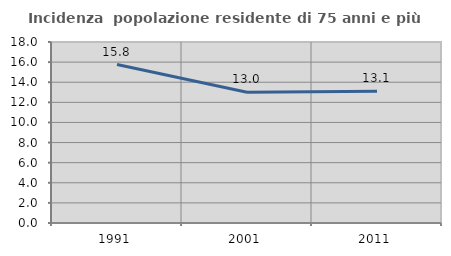
| Category | Incidenza  popolazione residente di 75 anni e più |
|---|---|
| 1991.0 | 15.758 |
| 2001.0 | 12.994 |
| 2011.0 | 13.095 |